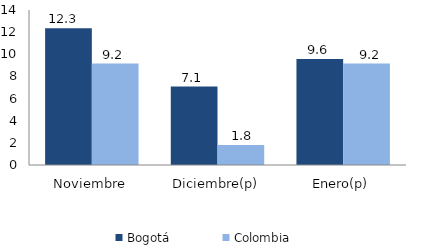
| Category | Bogotá | Colombia |
|---|---|---|
| Noviembre | 12.342 | 9.168 |
| Diciembre(p) | 7.086 | 1.797 |
| Enero(p) | 9.581 | 9.164 |